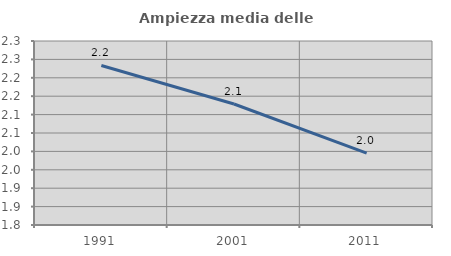
| Category | Ampiezza media delle famiglie |
|---|---|
| 1991.0 | 2.234 |
| 2001.0 | 2.129 |
| 2011.0 | 1.995 |